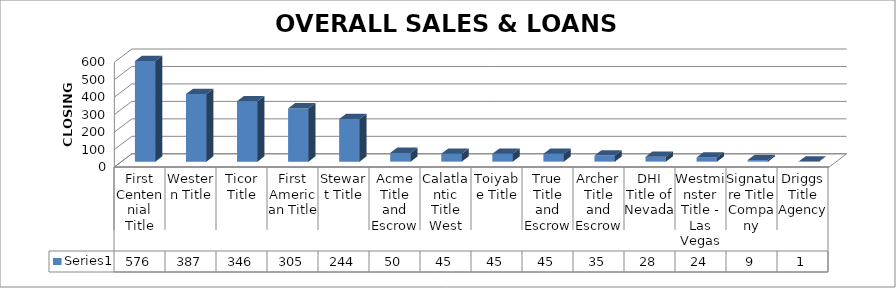
| Category | Series 0 |
|---|---|
| First Centennial Title | 576 |
| Western Title | 387 |
| Ticor Title | 346 |
| First American Title | 305 |
| Stewart Title | 244 |
| Acme Title and Escrow | 50 |
| Calatlantic Title West | 45 |
| Toiyabe Title | 45 |
| True Title and Escrow | 45 |
| Archer Title and Escrow | 35 |
| DHI Title of Nevada | 28 |
| Westminster Title - Las Vegas | 24 |
| Signature Title Company | 9 |
| Driggs Title Agency | 1 |